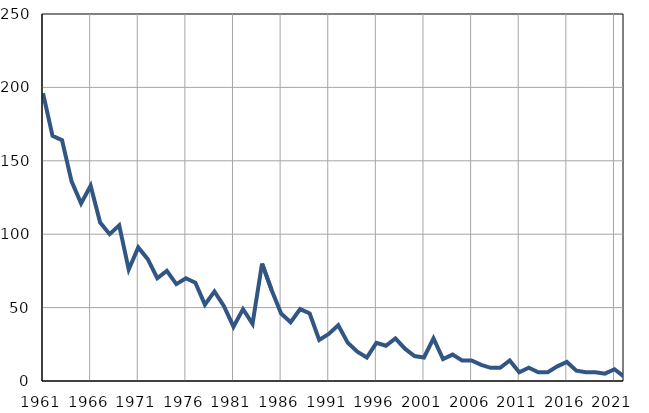
| Category | Infants
deaths |
|---|---|
| 1961.0 | 196 |
| 1962.0 | 167 |
| 1963.0 | 164 |
| 1964.0 | 136 |
| 1965.0 | 121 |
| 1966.0 | 133 |
| 1967.0 | 108 |
| 1968.0 | 100 |
| 1969.0 | 106 |
| 1970.0 | 76 |
| 1971.0 | 91 |
| 1972.0 | 83 |
| 1973.0 | 70 |
| 1974.0 | 75 |
| 1975.0 | 66 |
| 1976.0 | 70 |
| 1977.0 | 67 |
| 1978.0 | 52 |
| 1979.0 | 61 |
| 1980.0 | 51 |
| 1981.0 | 37 |
| 1982.0 | 49 |
| 1983.0 | 39 |
| 1984.0 | 80 |
| 1985.0 | 62 |
| 1986.0 | 46 |
| 1987.0 | 40 |
| 1988.0 | 49 |
| 1989.0 | 46 |
| 1990.0 | 28 |
| 1991.0 | 32 |
| 1992.0 | 38 |
| 1993.0 | 26 |
| 1994.0 | 20 |
| 1995.0 | 16 |
| 1996.0 | 26 |
| 1997.0 | 24 |
| 1998.0 | 29 |
| 1999.0 | 22 |
| 2000.0 | 17 |
| 2001.0 | 16 |
| 2002.0 | 29 |
| 2003.0 | 15 |
| 2004.0 | 18 |
| 2005.0 | 14 |
| 2006.0 | 14 |
| 2007.0 | 11 |
| 2008.0 | 9 |
| 2009.0 | 9 |
| 2010.0 | 14 |
| 2011.0 | 6 |
| 2012.0 | 9 |
| 2013.0 | 6 |
| 2014.0 | 6 |
| 2015.0 | 10 |
| 2016.0 | 13 |
| 2017.0 | 7 |
| 2018.0 | 6 |
| 2019.0 | 6 |
| 2020.0 | 5 |
| 2021.0 | 8 |
| 2022.0 | 3 |